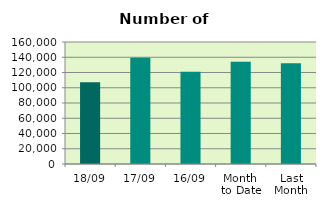
| Category | Series 0 |
|---|---|
| 18/09 | 107300 |
| 17/09 | 139498 |
| 16/09 | 120944 |
| Month 
to Date | 134261.231 |
| Last
Month | 132110.818 |